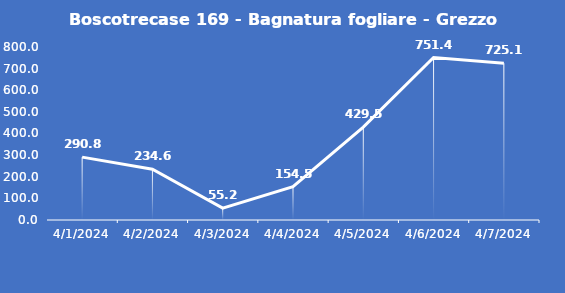
| Category | Boscotrecase 169 - Bagnatura fogliare - Grezzo (min) |
|---|---|
| 4/1/24 | 290.8 |
| 4/2/24 | 234.6 |
| 4/3/24 | 55.2 |
| 4/4/24 | 154.5 |
| 4/5/24 | 429.5 |
| 4/6/24 | 751.4 |
| 4/7/24 | 725.1 |